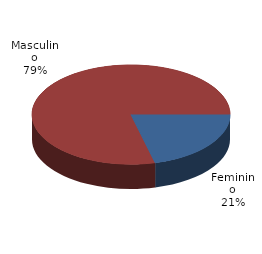
| Category | Qtde Vítimas |
|---|---|
| Feminino | 354 |
| Masculino | 1325 |